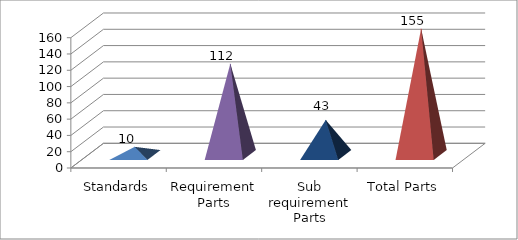
| Category | Series 0 |
|---|---|
| Standards | 10 |
| Requirement Parts | 112 |
| Sub requirement Parts | 43 |
| Total Parts | 155 |